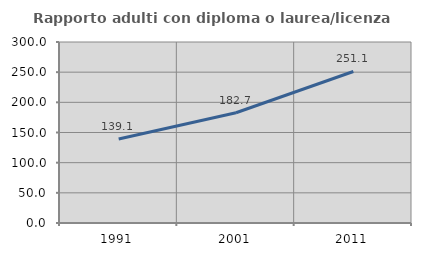
| Category | Rapporto adulti con diploma o laurea/licenza media  |
|---|---|
| 1991.0 | 139.114 |
| 2001.0 | 182.735 |
| 2011.0 | 251.123 |